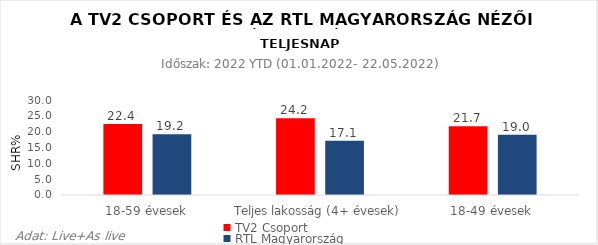
| Category | TV2 Csoport | RTL Magyarország |
|---|---|---|
| 18-59 évesek | 22.4 | 19.2 |
| Teljes lakosság (4+ évesek) | 24.2 | 17.1 |
| 18-49 évesek | 21.7 | 19 |